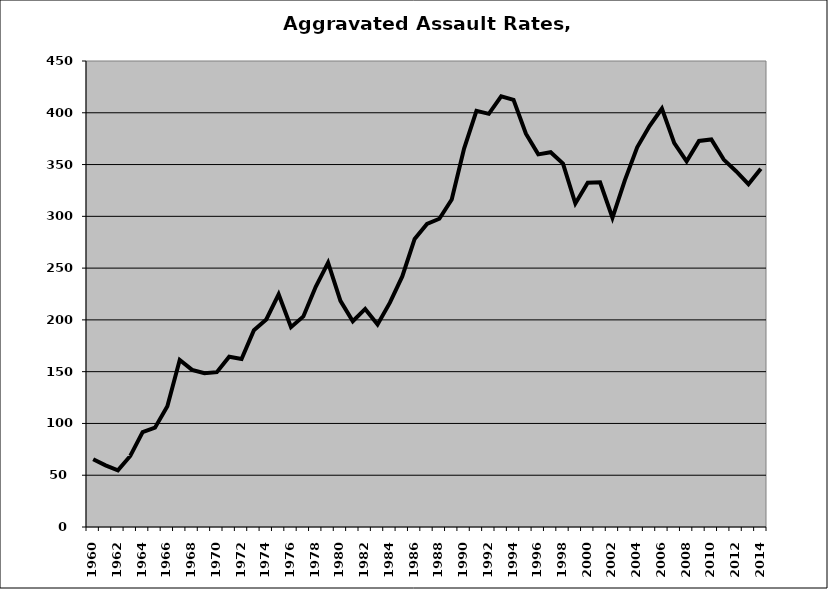
| Category | Aggravated Assault |
|---|---|
| 1960.0 | 65.5 |
| 1961.0 | 59.544 |
| 1962.0 | 54.8 |
| 1963.0 | 68.622 |
| 1964.0 | 91.671 |
| 1965.0 | 95.867 |
| 1966.0 | 116.624 |
| 1967.0 | 161.331 |
| 1968.0 | 151.69 |
| 1969.0 | 148.421 |
| 1970.0 | 149.535 |
| 1971.0 | 164.455 |
| 1972.0 | 162.184 |
| 1973.0 | 190.034 |
| 1974.0 | 200.485 |
| 1975.0 | 224.716 |
| 1976.0 | 192.935 |
| 1977.0 | 203.358 |
| 1978.0 | 231.93 |
| 1979.0 | 255.275 |
| 1980.0 | 218.429 |
| 1981.0 | 198.649 |
| 1982.0 | 210.563 |
| 1983.0 | 195.533 |
| 1984.0 | 216.645 |
| 1985.0 | 242.009 |
| 1986.0 | 278.162 |
| 1987.0 | 292.63 |
| 1988.0 | 297.647 |
| 1989.0 | 316.293 |
| 1990.0 | 365.419 |
| 1991.0 | 401.897 |
| 1992.0 | 398.958 |
| 1993.0 | 415.8 |
| 1994.0 | 412.475 |
| 1995.0 | 379.831 |
| 1996.0 | 359.841 |
| 1997.0 | 361.91 |
| 1998.0 | 350.906 |
| 1999.0 | 312.42 |
| 2000.0 | 332.423 |
| 2001.0 | 332.839 |
| 2002.0 | 298.603 |
| 2003.0 | 334.742 |
| 2004.0 | 366.655 |
| 2005.0 | 387.18 |
| 2006.0 | 404.038 |
| 2007.0 | 370.75 |
| 2008.0 | 353.132 |
| 2009.0 | 372.805 |
| 2010.0 | 374.256 |
| 2011.0 | 354.797 |
| 2012.0 | 343.545 |
| 2013.0 | 331.084 |
| 2014.0 | 346.046 |